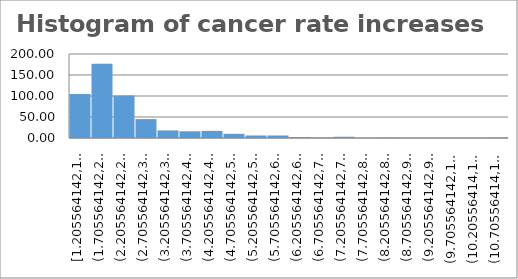
| Category | Series 0 |
|---|---|
| 2017.0 | 50884 |
| 2018.0 | 59857 |
| 2019.0 | 75169 |
| 2020.0 | 84049 |
| 2021.0 | 117187 |
| 2022.0 | 142354 |
| 2023.0 | 153607 |